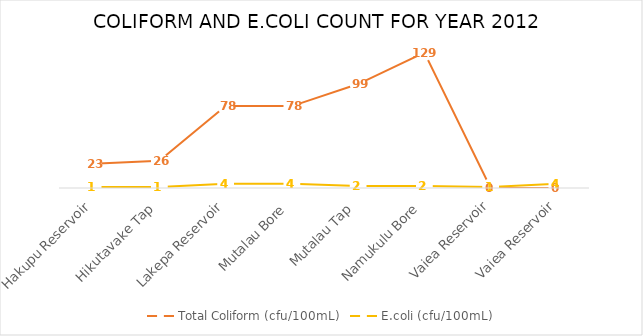
| Category | Total Coliform (cfu/100mL) | E.coli (cfu/100mL) |
|---|---|---|
| Hakupu Reservoir | 23 | 1 |
| Hikutavake Tap | 26 | 1 |
| Lakepa Reservoir | 78 | 4 |
| Mutalau Bore | 78 | 4 |
| Mutalau Tap | 99 | 2 |
| Namukulu Bore | 129 | 2 |
| Vaiea Reservoir | 0 | 1 |
| Vaiea Reservoir | 0 | 4 |